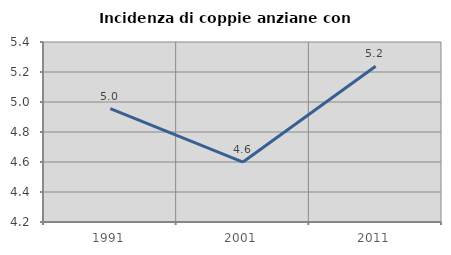
| Category | Incidenza di coppie anziane con figli |
|---|---|
| 1991.0 | 4.956 |
| 2001.0 | 4.6 |
| 2011.0 | 5.238 |